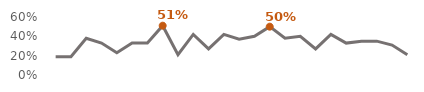
| Category | Monday |
|---|---|
| 1994.0 | 0.19 |
| 1995.0 | 0.19 |
| 1996.0 | 0.38 |
| 1997.0 | 0.33 |
| 1998.0 | 0.23 |
| 1999.0 | 0.33 |
| 2000.0 | 0.33 |
| 2001.0 | 0.51 |
| 2002.0 | 0.21 |
| 2003.0 | 0.42 |
| 2004.0 | 0.27 |
| 2005.0 | 0.42 |
| 2006.0 | 0.37 |
| 2007.0 | 0.4 |
| 2008.0 | 0.5 |
| 2009.0 | 0.38 |
| 2010.0 | 0.4 |
| 2011.0 | 0.27 |
| 2012.0 | 0.42 |
| 2013.0 | 0.33 |
| 2014.0 | 0.35 |
| 2015.0 | 0.35 |
| 2016.0 | 0.31 |
| 2017.0 | 0.21 |